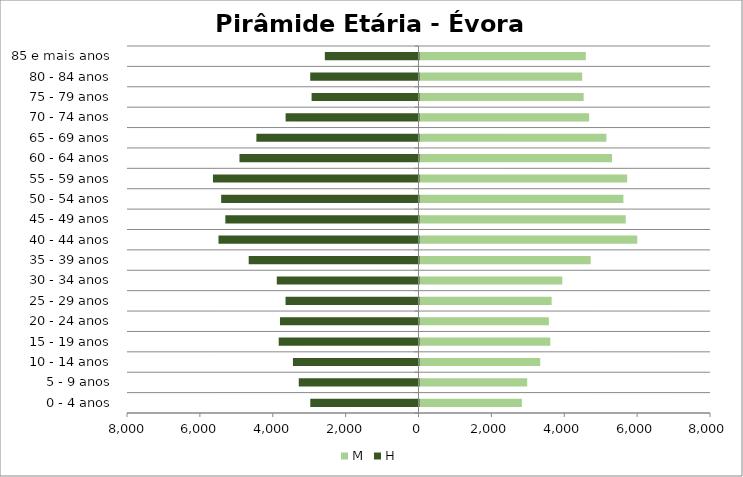
| Category | M | H |
|---|---|---|
| 0 - 4 anos | 2810 | -2970 |
| 5 - 9 anos | 2956 | -3286 |
| 10 - 14 anos | 3314 | -3446 |
| 15 - 19 anos | 3590 | -3836 |
| 20 - 24 anos | 3551 | -3802 |
| 25 - 29 anos | 3626 | -3649 |
| 30 - 34 anos | 3918 | -3889 |
| 35 - 39 anos | 4699 | -4660 |
| 40 - 44 anos | 5976 | -5489 |
| 45 - 49 anos | 5659 | -5301 |
| 50 - 54 anos | 5596 | -5416 |
| 55 - 59 anos | 5700 | -5641 |
| 60 - 64 anos | 5282 | -4913 |
| 65 - 69 anos | 5129 | -4449 |
| 70 - 74 anos | 4655 | -3647 |
| 75 - 79 anos | 4505 | -2934 |
| 80 - 84 anos | 4465 | -2972 |
| 85 e mais anos | 4564 | -2570 |